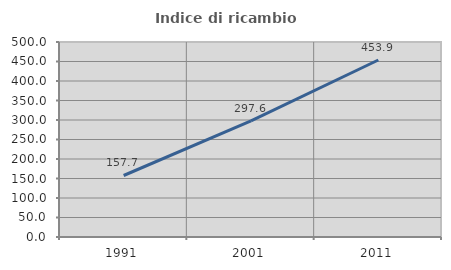
| Category | Indice di ricambio occupazionale  |
|---|---|
| 1991.0 | 157.696 |
| 2001.0 | 297.646 |
| 2011.0 | 453.892 |